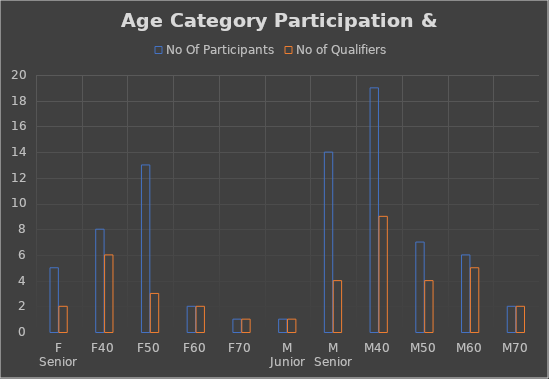
| Category | No Of Participants | No of Qualifiers |
|---|---|---|
| F Senior | 5 | 2 |
| F40 | 8 | 6 |
| F50 | 13 | 3 |
| F60 | 2 | 2 |
| F70 | 1 | 1 |
| M Junior | 1 | 1 |
| M Senior | 14 | 4 |
| M40 | 19 | 9 |
| M50 | 7 | 4 |
| M60 | 6 | 5 |
| M70 | 2 | 2 |